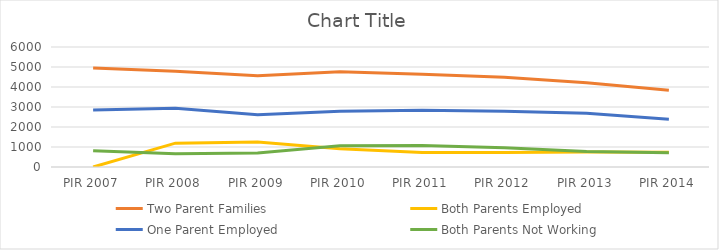
| Category | Two Parent Families | Both Parents Employed | One Parent Employed | Both Parents Not Working |
|---|---|---|---|---|
| PIR 2007 | 4948 | 0 | 2852 | 812 |
| PIR 2008 | 4782 | 1191 | 2934 | 657 |
| PIR 2009 | 4557 | 1244 | 2607 | 706 |
| PIR 2010 | 4759 | 917 | 2785 | 1057 |
| PIR 2011 | 4634 | 728 | 2833 | 1070 |
| PIR 2012 | 4482 | 729 | 2789 | 964 |
| PIR 2013 | 4210 | 753 | 2684 | 773 |
| PIR 2014 | 3835 | 732 | 2389 | 714 |